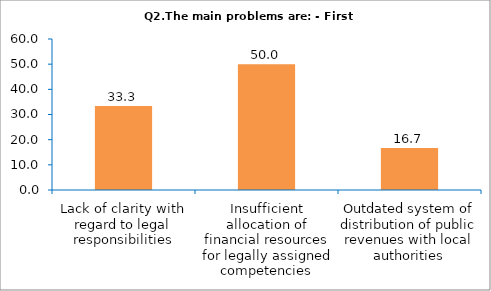
| Category | Series 0 |
|---|---|
| Lack of clarity with regard to legal responsibilities | 33.333 |
| Insufficient allocation of financial resources for legally assigned competencies | 50 |
| Outdated system of distribution of public revenues with local authorities | 16.667 |